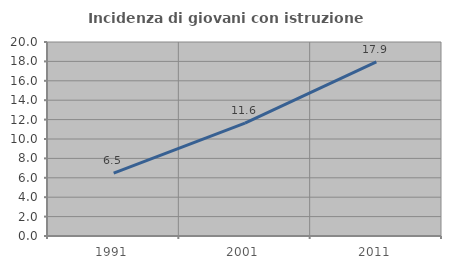
| Category | Incidenza di giovani con istruzione universitaria |
|---|---|
| 1991.0 | 6.475 |
| 2001.0 | 11.636 |
| 2011.0 | 17.949 |